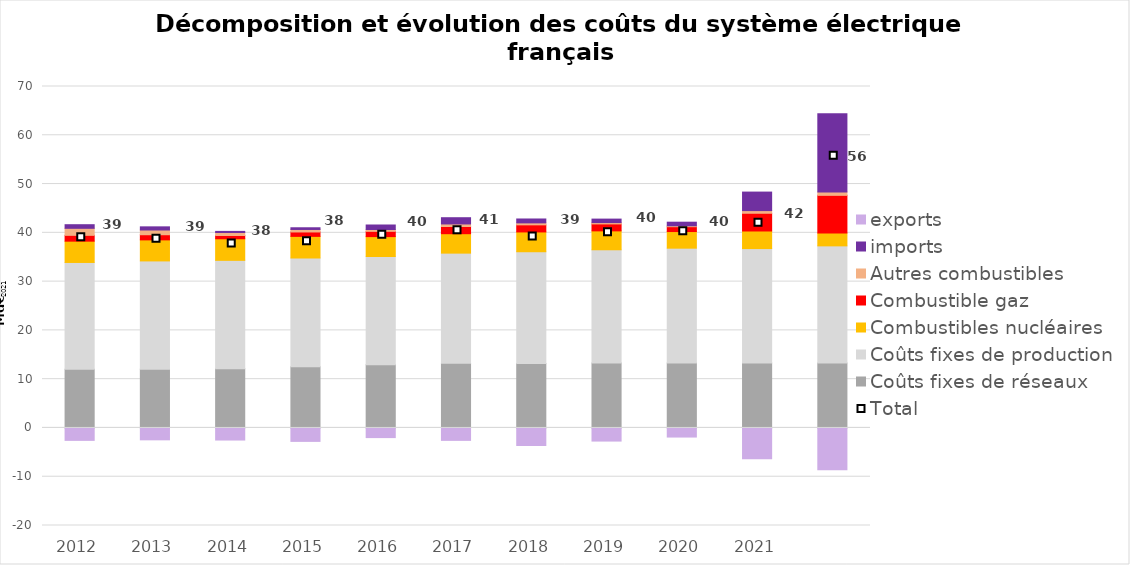
| Category | Coûts fixes de réseaux | Coûts fixes de production | Combustibles nucléaires | Combustible gaz | Autres combustibles | imports | exports |
|---|---|---|---|---|---|---|---|
| 2012.0 | 12.016 | 21.909 | 4.367 | 1.194 | 1.442 | 0.741 | -2.551 |
| 2013.0 | 12.016 | 22.225 | 4.315 | 1.054 | 0.972 | 0.646 | -2.438 |
| 2014.0 | 12.143 | 22.217 | 4.423 | 0.674 | 0.607 | 0.23 | -2.48 |
| 2015.0 | 12.563 | 22.278 | 4.433 | 0.903 | 0.514 | 0.348 | -2.756 |
| 2016.0 | 12.964 | 22.186 | 4.076 | 1.08 | 0.374 | 0.927 | -1.979 |
| 2017.0 | 13.278 | 22.562 | 3.984 | 1.477 | 0.521 | 1.279 | -2.549 |
| 2018.0 | 13.233 | 22.892 | 4.059 | 1.454 | 0.404 | 0.798 | -3.601 |
| 2019.0 | 13.313 | 23.216 | 3.875 | 1.424 | 0.275 | 0.713 | -2.692 |
| 2020.0 | 13.334 | 23.522 | 3.408 | 0.995 | 0.189 | 0.734 | -1.866 |
| 2021.0 | 13.334 | 23.439 | 3.606 | 3.633 | 0.546 | 3.797 | -6.299 |